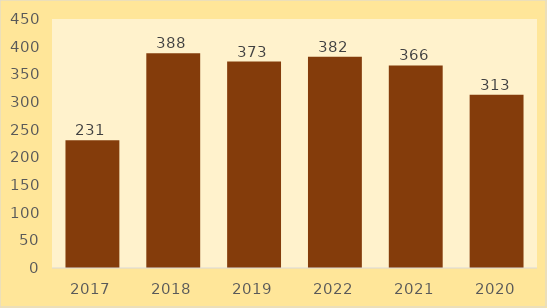
| Category | Leje Ndërtimi |
|---|---|
| 2017.0 | 231 |
| 2018.0 | 388 |
| 2019.0 | 373 |
| 2022.0 | 382 |
| 2021.0 | 366 |
| 2020.0 | 313 |